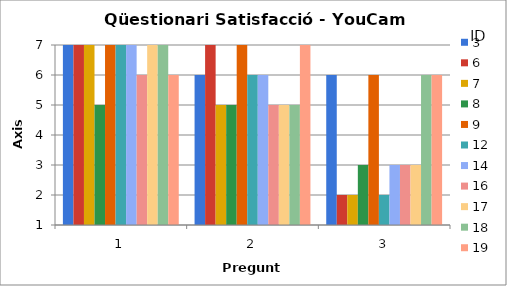
| Category | 3 | 6 | 7 | 8 | 9 | 12 | 14 | 16 | 17 | 18 | 19 |
|---|---|---|---|---|---|---|---|---|---|---|---|
| 1.0 | 7 | 7 | 7 | 5 | 7 | 7 | 7 | 6 | 7 | 7 | 6 |
| 2.0 | 6 | 7 | 5 | 5 | 7 | 6 | 6 | 5 | 5 | 5 | 7 |
| 3.0 | 6 | 2 | 2 | 3 | 6 | 2 | 3 | 3 | 3 | 6 | 6 |